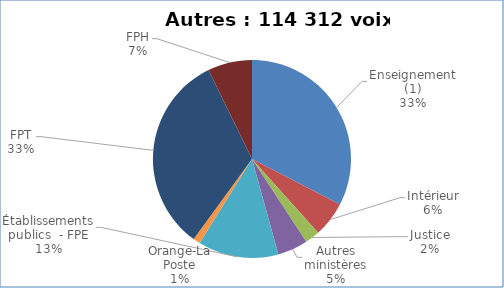
| Category | Nombre de voix |
|---|---|
| Enseignement (1) | 37252 |
| Intérieur | 6597 |
| Justice | 2758 |
| Autres ministères | 5646.5 |
| Établissements publics  - FPE | 15045 |
| Orange-La Poste | 1305 |
| FPT | 37442 |
| FPH | 8266.5 |